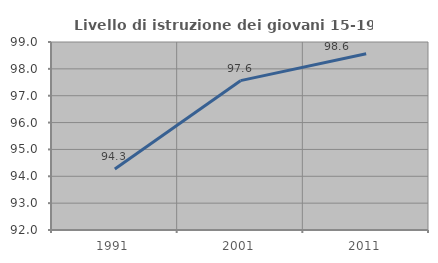
| Category | Livello di istruzione dei giovani 15-19 anni |
|---|---|
| 1991.0 | 94.275 |
| 2001.0 | 97.561 |
| 2011.0 | 98.565 |